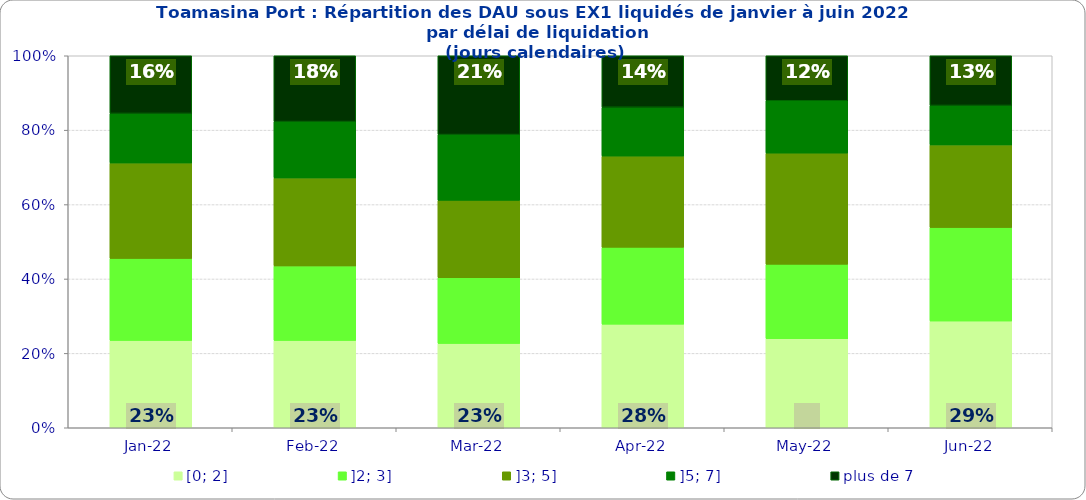
| Category | [0; 2] | ]2; 3] | ]3; 5] | ]5; 7] | plus de 7 |
|---|---|---|---|---|---|
| 2022-01-01 | 0.235 | 0.221 | 0.256 | 0.133 | 0.155 |
| 2022-02-01 | 0.235 | 0.2 | 0.236 | 0.152 | 0.177 |
| 2022-03-01 | 0.227 | 0.177 | 0.208 | 0.177 | 0.212 |
| 2022-04-01 | 0.278 | 0.207 | 0.245 | 0.131 | 0.138 |
| 2022-05-01 | 0.24 | 0.2 | 0.299 | 0.141 | 0.121 |
| 2022-06-01 | 0.287 | 0.251 | 0.222 | 0.106 | 0.134 |